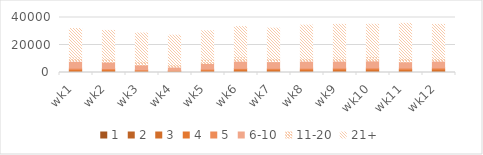
| Category | 1 | 2 | 3 | 4 | 5 | 6-10 | 11-20 | 21+ |
|---|---|---|---|---|---|---|---|---|
| wk1 | 406 | 487 | 608 | 701 | 941 | 5019 | 3036 | 20817 |
| wk2 | 433 | 600 | 423 | 659 | 785 | 4608 | 2395 | 20699 |
| wk3 | 341 | 330 | 346 | 557 | 486 | 3452 | 2557 | 20656 |
| wk4 | 267 | 374 | 218 | 340 | 325 | 2433 | 2106 | 21096 |
| wk5 | 426 | 514 | 340 | 553 | 667 | 4041 | 3139 | 20631 |
| wk6 | 666 | 332 | 611 | 824 | 572 | 5259 | 3233 | 21899 |
| wk7 | 680 | 362 | 667 | 662 | 697 | 4829 | 2979 | 21387 |
| wk8 | 478 | 557 | 622 | 744 | 759 | 5094 | 2640 | 23570 |
| wk9 | 507 | 448 | 776 | 811 | 721 | 5040 | 2871 | 23841 |
| wk10 | 711 | 290 | 846 | 704 | 830 | 5087 | 3178 | 23440 |
| wk11 | 576 | 439 | 735 | 610 | 931 | 4444 | 3281 | 24749 |
| wk12 | 588 | 490 | 800 | 700 | 831 | 4892 | 2730 | 23967 |